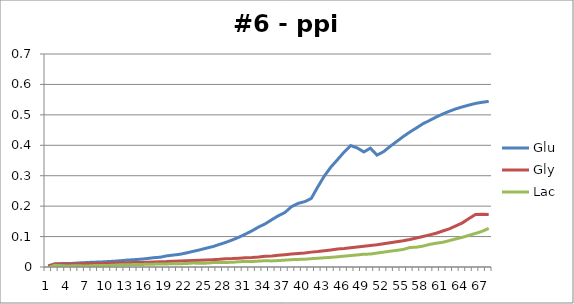
| Category | Glu | Gly | Lac |
|---|---|---|---|
| 0 | 0.003 | 0.003 | -0.003 |
| 1 | 0.01 | 0.01 | 0.006 |
| 2 | 0.011 | 0.01 | 0.004 |
| 3 | 0.011 | 0.01 | 0.003 |
| 4 | 0.012 | 0.01 | 0.004 |
| 5 | 0.014 | 0.01 | 0.004 |
| 6 | 0.015 | 0.011 | 0.003 |
| 7 | 0.016 | 0.011 | 0.005 |
| 8 | 0.016 | 0.012 | 0.005 |
| 9 | 0.018 | 0.012 | 0.005 |
| 10 | 0.019 | 0.013 | 0.006 |
| 11 | 0.021 | 0.014 | 0.007 |
| 12 | 0.023 | 0.014 | 0.007 |
| 13 | 0.024 | 0.014 | 0.008 |
| 14 | 0.026 | 0.015 | 0.008 |
| 15 | 0.028 | 0.016 | 0.009 |
| 16 | 0.03 | 0.016 | 0.009 |
| 17 | 0.032 | 0.017 | 0.01 |
| 18 | 0.036 | 0.018 | 0.01 |
| 19 | 0.039 | 0.019 | 0.011 |
| 20 | 0.042 | 0.019 | 0.011 |
| 21 | 0.046 | 0.02 | 0.011 |
| 22 | 0.051 | 0.021 | 0.013 |
| 23 | 0.056 | 0.022 | 0.012 |
| 24 | 0.062 | 0.023 | 0.013 |
| 25 | 0.067 | 0.024 | 0.014 |
| 26 | 0.074 | 0.025 | 0.015 |
| 27 | 0.081 | 0.027 | 0.015 |
| 28 | 0.089 | 0.028 | 0.015 |
| 29 | 0.098 | 0.029 | 0.017 |
| 30 | 0.108 | 0.031 | 0.018 |
| 31 | 0.119 | 0.032 | 0.018 |
| 32 | 0.131 | 0.033 | 0.019 |
| 33 | 0.142 | 0.035 | 0.021 |
| 34 | 0.155 | 0.036 | 0.02 |
| 35 | 0.169 | 0.038 | 0.021 |
| 36 | 0.179 | 0.04 | 0.023 |
| 37 | 0.198 | 0.043 | 0.024 |
| 38 | 0.209 | 0.044 | 0.025 |
| 39 | 0.215 | 0.046 | 0.025 |
| 40 | 0.225 | 0.049 | 0.027 |
| 41 | 0.263 | 0.051 | 0.029 |
| 42 | 0.299 | 0.053 | 0.03 |
| 43 | 0.329 | 0.056 | 0.032 |
| 44 | 0.353 | 0.059 | 0.034 |
| 45 | 0.378 | 0.061 | 0.036 |
| 46 | 0.399 | 0.063 | 0.038 |
| 47 | 0.391 | 0.065 | 0.04 |
| 48 | 0.378 | 0.068 | 0.042 |
| 49 | 0.39 | 0.071 | 0.043 |
| 50 | 0.368 | 0.073 | 0.046 |
| 51 | 0.379 | 0.077 | 0.049 |
| 52 | 0.396 | 0.08 | 0.052 |
| 53 | 0.413 | 0.083 | 0.055 |
| 54 | 0.429 | 0.086 | 0.058 |
| 55 | 0.443 | 0.09 | 0.064 |
| 56 | 0.457 | 0.095 | 0.065 |
| 57 | 0.471 | 0.1 | 0.069 |
| 58 | 0.481 | 0.106 | 0.074 |
| 59 | 0.493 | 0.111 | 0.078 |
| 60 | 0.503 | 0.118 | 0.081 |
| 61 | 0.512 | 0.125 | 0.087 |
| 62 | 0.52 | 0.135 | 0.092 |
| 63 | 0.526 | 0.145 | 0.098 |
| 64 | 0.532 | 0.16 | 0.104 |
| 65 | 0.538 | 0.173 | 0.11 |
| 66 | 0.541 | 0.173 | 0.117 |
| 67 | 0.544 | 0.172 | 0.127 |